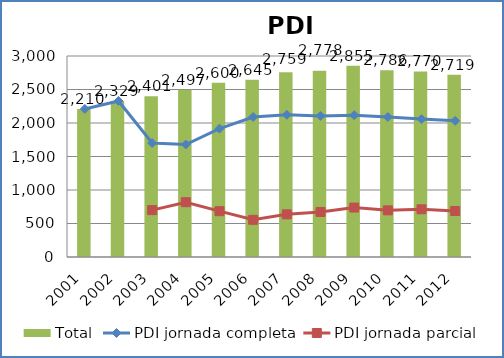
| Category | Total |
|---|---|
| 2001 | 2210 |
| 2002 | 2329 |
| 2003 | 2401 |
| 2004 | 2497 |
| 2005 | 2600 |
| 2006 | 2645 |
| 2007 | 2759 |
| 2008 | 2778 |
| 2009 | 2855 |
| 2010 | 2786 |
| 2011 | 2770 |
| 2012 | 2719 |